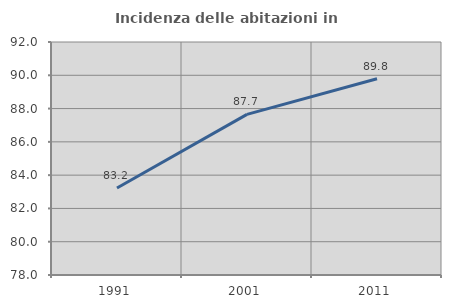
| Category | Incidenza delle abitazioni in proprietà  |
|---|---|
| 1991.0 | 83.23 |
| 2001.0 | 87.654 |
| 2011.0 | 89.79 |